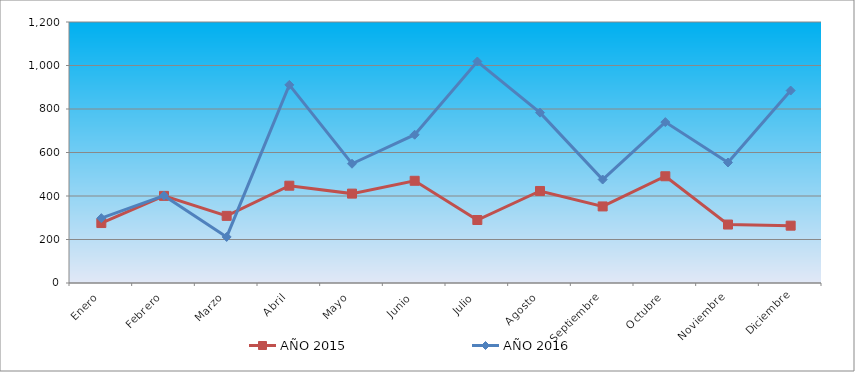
| Category | AÑO 2015 | AÑO 2016 |
|---|---|---|
| Enero | 275.718 | 298.17 |
| Febrero | 400.571 | 401.447 |
| Marzo | 308.665 | 211.773 |
| Abril | 447.391 | 910.914 |
| Mayo | 410.975 | 548.289 |
| Junio | 469.934 | 681.735 |
| Julio | 289.59 | 1018.251 |
| Agosto | 423.114 | 783.27 |
| Septiembre | 352.017 | 475.764 |
| Octubre | 490.743 | 739.755 |
| Noviembre | 268.781 | 554.091 |
| Diciembre | 263.579 | 884.805 |